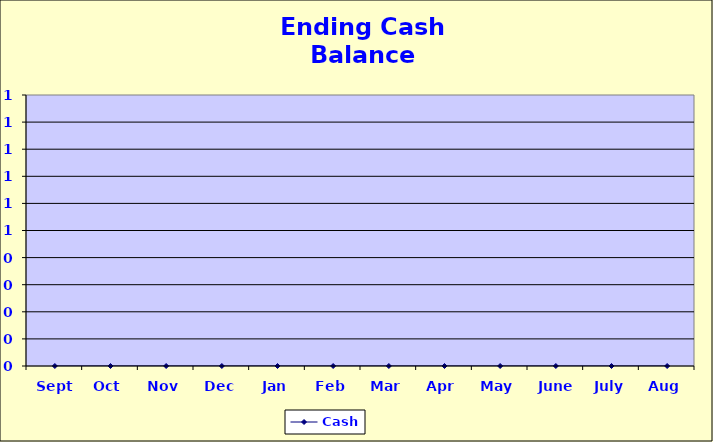
| Category | Cash |
|---|---|
| Sept | 0 |
| Oct | 0 |
| Nov | 0 |
| Dec | 0 |
| Jan | 0 |
| Feb | 0 |
| Mar | 0 |
| Apr | 0 |
| May | 0 |
| June | 0 |
| July | 0 |
| Aug | 0 |